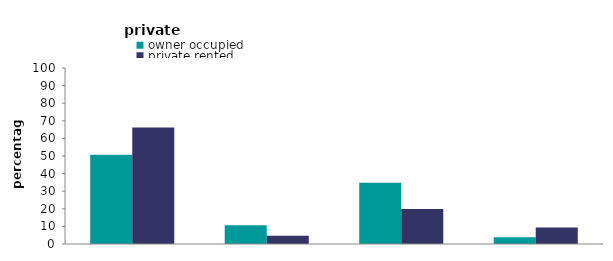
| Category | owner occupied | private rented |
|---|---|---|
| not hard to treat | 50.758 | 66.145 |
| fully boarded loft | 10.606 | 4.665 |
| room in roof | 34.741 | 19.882 |
| flat or shallow pitch | 3.895 | 9.308 |